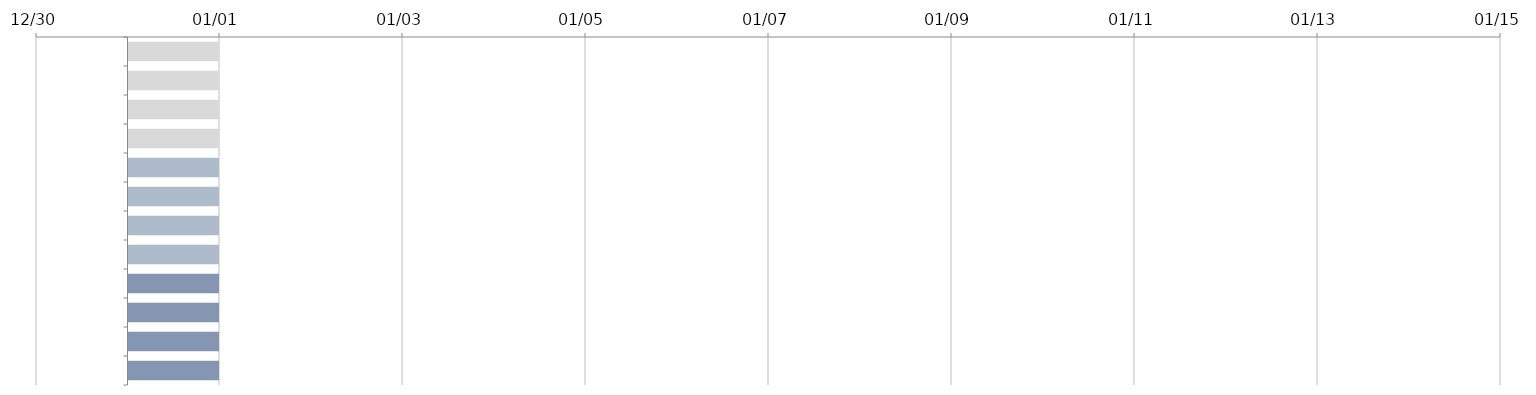
| Category | DÉBUT | JOURS |
|---|---|---|
|  |  | 1 |
|  |  | 1 |
|  |  | 1 |
|  |  | 1 |
|  |  | 1 |
|  |  | 1 |
|  |  | 1 |
|  |  | 1 |
|  |  | 1 |
|  |  | 1 |
|  |  | 1 |
|  |  | 1 |